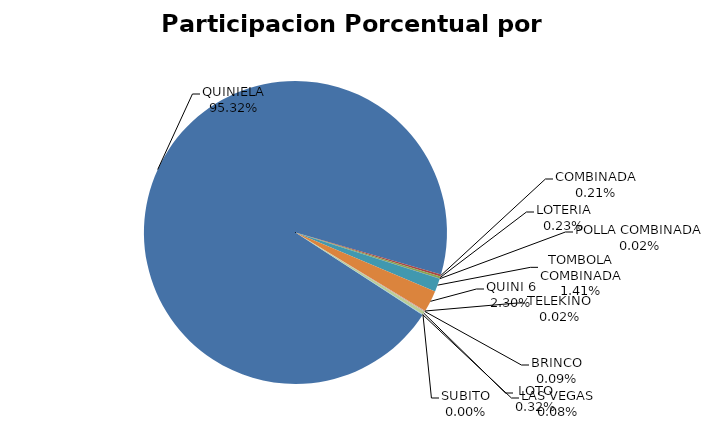
| Category | Series 0 |
|---|---|
| QUINIELA | 61578409.99 |
| COMBINADA | 135264.22 |
| LOTERIA | 150385.72 |
| POLLA COMBINADA | 13196 |
| TOMBOLA COMBINADA | 912545 |
| QUINI 6 | 1487144.1 |
| TELEKINO | 13894 |
| BRINCO | 60217.31 |
| LOTO | 205765 |
| SUBITO | 0 |
| LAS VEGAS | 48576 |